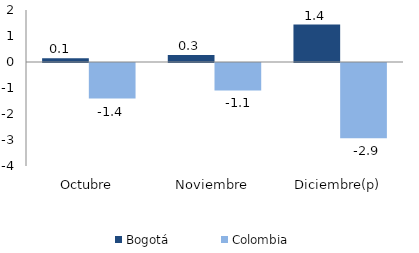
| Category | Bogotá | Colombia |
|---|---|---|
| Octubre | 0.147 | -1.37 |
| Noviembre | 0.268 | -1.054 |
| Diciembre(p) | 1.442 | -2.898 |